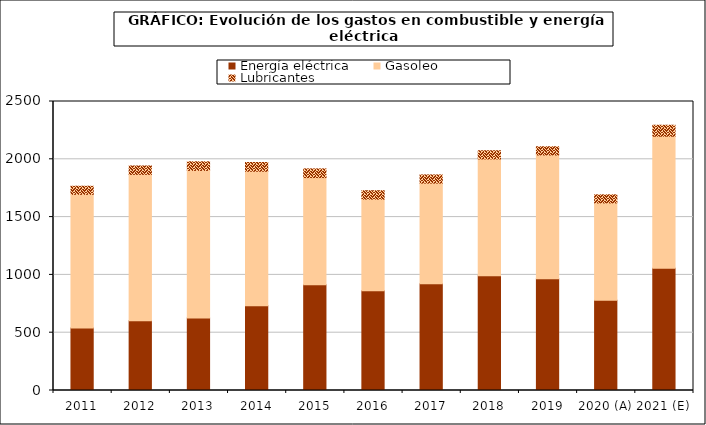
| Category | Energía eléctrica | Gasoleo | Lubricantes |
|---|---|---|---|
| 2011 | 541.39 | 1155.464 | 70.222 |
| 2012 | 602.887 | 1266.655 | 72.753 |
| 2013 | 628.022 | 1275.795 | 74.642 |
| 2014 | 733.314 | 1163.411 | 75.37 |
| 2015 | 915.498 | 926.353 | 75.218 |
| 2016 | 861.816 | 793.633 | 72.641 |
| 2017 | 922.733 | 871.301 | 70.822 |
| 2018 | 993.507 | 1009.663 | 70.844 |
| 2019 | 965.958 | 1071.529 | 71.16 |
| 2020 (A) | 780.212 | 842.603 | 69.855 |
| 2021 (E) | 1057.629 | 1142.205 | 94.693 |